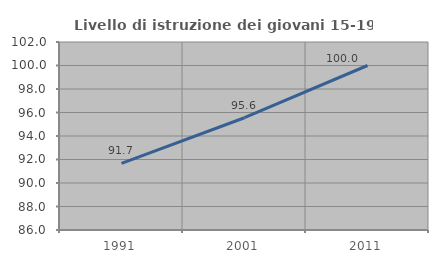
| Category | Livello di istruzione dei giovani 15-19 anni |
|---|---|
| 1991.0 | 91.667 |
| 2001.0 | 95.556 |
| 2011.0 | 100 |